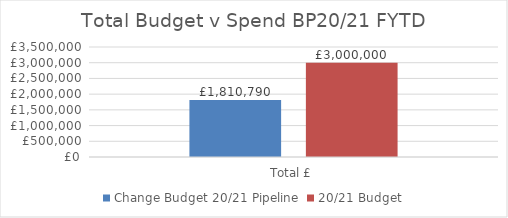
| Category | Change Budget 20/21 Pipeline | 20/21 Budget |
|---|---|---|
| Total £ | 1810790.042 | 3000000 |